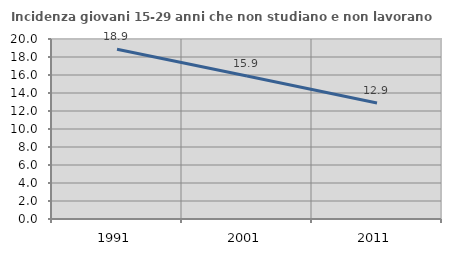
| Category | Incidenza giovani 15-29 anni che non studiano e non lavorano  |
|---|---|
| 1991.0 | 18.852 |
| 2001.0 | 15.88 |
| 2011.0 | 12.883 |